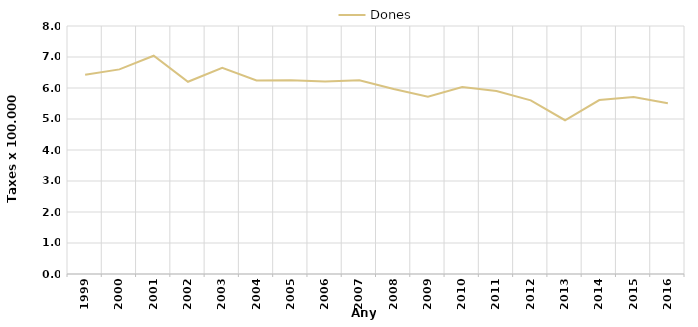
| Category | Dones |
|---|---|
| 1999.0 | 6.43 |
| 2000.0 | 6.6 |
| 2001.0 | 7.04 |
| 2002.0 | 6.2 |
| 2003.0 | 6.65 |
| 2004.0 | 6.24 |
| 2005.0 | 6.25 |
| 2006.0 | 6.21 |
| 2007.0 | 6.25 |
| 2008.0 | 5.97 |
| 2009.0 | 5.72 |
| 2010.0 | 6.03 |
| 2011.0 | 5.9 |
| 2012.0 | 5.6 |
| 2013.0 | 4.96 |
| 2014.0 | 5.61 |
| 2015.0 | 5.71 |
| 2016.0 | 5.51 |